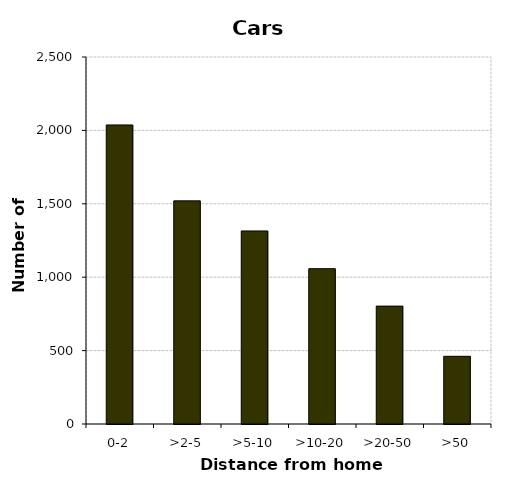
| Category | Cars |
|---|---|
| 0-2 | 2037 |
| >2-5 | 1520 |
| >5-10 | 1315 |
| >10-20 | 1058 |
| >20-50 | 803 |
| >50 | 461 |